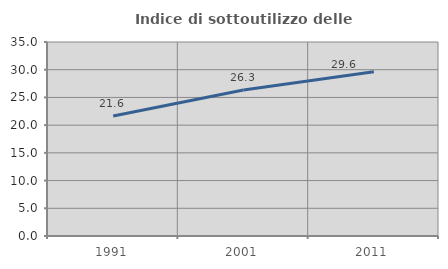
| Category | Indice di sottoutilizzo delle abitazioni  |
|---|---|
| 1991.0 | 21.64 |
| 2001.0 | 26.339 |
| 2011.0 | 29.632 |